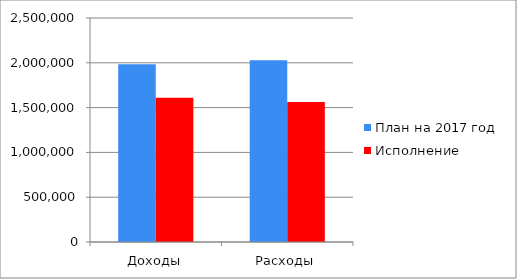
| Category | План на 2017 год | Исполнение |
|---|---|---|
| Доходы | 1983318.7 | 1609234.7 |
| Расходы | 2028804 | 1562976.8 |